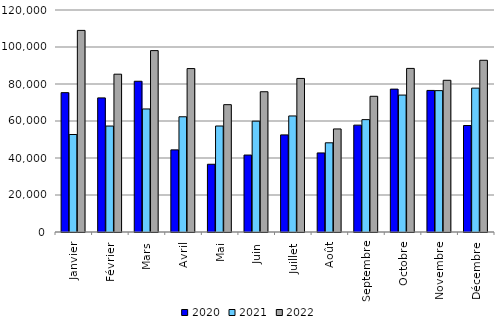
| Category | 2020 | 2021 | 2022 |
|---|---|---|---|
| Janvier | 75328 | 52699 | 108978 |
| Février | 72498 | 57273 | 85303 |
| Mars | 81485 | 66505 | 98052 |
| Avril | 44393 | 62286 | 88344 |
| Mai | 36614 | 57291 | 68829 |
| Juin | 41592 | 59910 | 75817 |
| Juillet | 52497 | 62721 | 83001 |
| Août | 42731 | 48214 | 55704 |
| Septembre | 57768 | 60736 | 73359 |
| Octobre | 77236 | 74017 | 88421 |
| Novembre | 76525 | 76413 | 82005 |
| Décembre | 57566 | 77767 | 92823 |